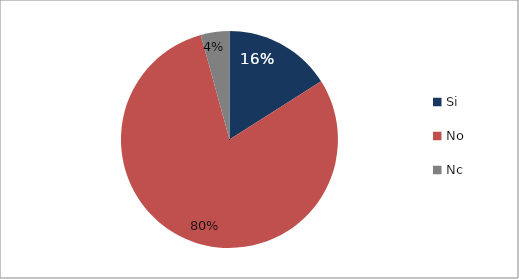
| Category | Series 0 | Series 1 | Series 2 |
|---|---|---|---|
| Si |  |  | 60 |
| No |  |  | 299 |
| Nc |  |  | 16 |